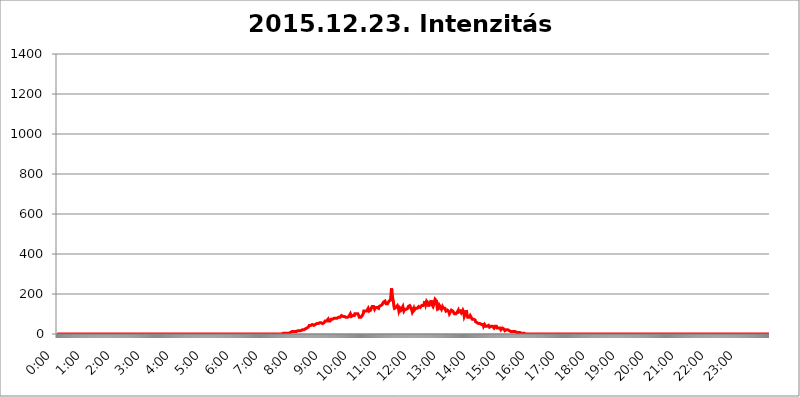
| Category | 2015.12.23. Intenzitás [W/m^2] |
|---|---|
| 0.0 | 0 |
| 0.0006944444444444445 | 0 |
| 0.001388888888888889 | 0 |
| 0.0020833333333333333 | 0 |
| 0.002777777777777778 | 0 |
| 0.003472222222222222 | 0 |
| 0.004166666666666667 | 0 |
| 0.004861111111111111 | 0 |
| 0.005555555555555556 | 0 |
| 0.0062499999999999995 | 0 |
| 0.006944444444444444 | 0 |
| 0.007638888888888889 | 0 |
| 0.008333333333333333 | 0 |
| 0.009027777777777779 | 0 |
| 0.009722222222222222 | 0 |
| 0.010416666666666666 | 0 |
| 0.011111111111111112 | 0 |
| 0.011805555555555555 | 0 |
| 0.012499999999999999 | 0 |
| 0.013194444444444444 | 0 |
| 0.013888888888888888 | 0 |
| 0.014583333333333332 | 0 |
| 0.015277777777777777 | 0 |
| 0.015972222222222224 | 0 |
| 0.016666666666666666 | 0 |
| 0.017361111111111112 | 0 |
| 0.018055555555555557 | 0 |
| 0.01875 | 0 |
| 0.019444444444444445 | 0 |
| 0.02013888888888889 | 0 |
| 0.020833333333333332 | 0 |
| 0.02152777777777778 | 0 |
| 0.022222222222222223 | 0 |
| 0.02291666666666667 | 0 |
| 0.02361111111111111 | 0 |
| 0.024305555555555556 | 0 |
| 0.024999999999999998 | 0 |
| 0.025694444444444447 | 0 |
| 0.02638888888888889 | 0 |
| 0.027083333333333334 | 0 |
| 0.027777777777777776 | 0 |
| 0.02847222222222222 | 0 |
| 0.029166666666666664 | 0 |
| 0.029861111111111113 | 0 |
| 0.030555555555555555 | 0 |
| 0.03125 | 0 |
| 0.03194444444444445 | 0 |
| 0.03263888888888889 | 0 |
| 0.03333333333333333 | 0 |
| 0.034027777777777775 | 0 |
| 0.034722222222222224 | 0 |
| 0.035416666666666666 | 0 |
| 0.036111111111111115 | 0 |
| 0.03680555555555556 | 0 |
| 0.0375 | 0 |
| 0.03819444444444444 | 0 |
| 0.03888888888888889 | 0 |
| 0.03958333333333333 | 0 |
| 0.04027777777777778 | 0 |
| 0.04097222222222222 | 0 |
| 0.041666666666666664 | 0 |
| 0.042361111111111106 | 0 |
| 0.04305555555555556 | 0 |
| 0.043750000000000004 | 0 |
| 0.044444444444444446 | 0 |
| 0.04513888888888889 | 0 |
| 0.04583333333333334 | 0 |
| 0.04652777777777778 | 0 |
| 0.04722222222222222 | 0 |
| 0.04791666666666666 | 0 |
| 0.04861111111111111 | 0 |
| 0.049305555555555554 | 0 |
| 0.049999999999999996 | 0 |
| 0.05069444444444445 | 0 |
| 0.051388888888888894 | 0 |
| 0.052083333333333336 | 0 |
| 0.05277777777777778 | 0 |
| 0.05347222222222222 | 0 |
| 0.05416666666666667 | 0 |
| 0.05486111111111111 | 0 |
| 0.05555555555555555 | 0 |
| 0.05625 | 0 |
| 0.05694444444444444 | 0 |
| 0.057638888888888885 | 0 |
| 0.05833333333333333 | 0 |
| 0.05902777777777778 | 0 |
| 0.059722222222222225 | 0 |
| 0.06041666666666667 | 0 |
| 0.061111111111111116 | 0 |
| 0.06180555555555556 | 0 |
| 0.0625 | 0 |
| 0.06319444444444444 | 0 |
| 0.06388888888888888 | 0 |
| 0.06458333333333334 | 0 |
| 0.06527777777777778 | 0 |
| 0.06597222222222222 | 0 |
| 0.06666666666666667 | 0 |
| 0.06736111111111111 | 0 |
| 0.06805555555555555 | 0 |
| 0.06874999999999999 | 0 |
| 0.06944444444444443 | 0 |
| 0.07013888888888889 | 0 |
| 0.07083333333333333 | 0 |
| 0.07152777777777779 | 0 |
| 0.07222222222222223 | 0 |
| 0.07291666666666667 | 0 |
| 0.07361111111111111 | 0 |
| 0.07430555555555556 | 0 |
| 0.075 | 0 |
| 0.07569444444444444 | 0 |
| 0.0763888888888889 | 0 |
| 0.07708333333333334 | 0 |
| 0.07777777777777778 | 0 |
| 0.07847222222222222 | 0 |
| 0.07916666666666666 | 0 |
| 0.0798611111111111 | 0 |
| 0.08055555555555556 | 0 |
| 0.08125 | 0 |
| 0.08194444444444444 | 0 |
| 0.08263888888888889 | 0 |
| 0.08333333333333333 | 0 |
| 0.08402777777777777 | 0 |
| 0.08472222222222221 | 0 |
| 0.08541666666666665 | 0 |
| 0.08611111111111112 | 0 |
| 0.08680555555555557 | 0 |
| 0.08750000000000001 | 0 |
| 0.08819444444444445 | 0 |
| 0.08888888888888889 | 0 |
| 0.08958333333333333 | 0 |
| 0.09027777777777778 | 0 |
| 0.09097222222222222 | 0 |
| 0.09166666666666667 | 0 |
| 0.09236111111111112 | 0 |
| 0.09305555555555556 | 0 |
| 0.09375 | 0 |
| 0.09444444444444444 | 0 |
| 0.09513888888888888 | 0 |
| 0.09583333333333333 | 0 |
| 0.09652777777777777 | 0 |
| 0.09722222222222222 | 0 |
| 0.09791666666666667 | 0 |
| 0.09861111111111111 | 0 |
| 0.09930555555555555 | 0 |
| 0.09999999999999999 | 0 |
| 0.10069444444444443 | 0 |
| 0.1013888888888889 | 0 |
| 0.10208333333333335 | 0 |
| 0.10277777777777779 | 0 |
| 0.10347222222222223 | 0 |
| 0.10416666666666667 | 0 |
| 0.10486111111111111 | 0 |
| 0.10555555555555556 | 0 |
| 0.10625 | 0 |
| 0.10694444444444444 | 0 |
| 0.1076388888888889 | 0 |
| 0.10833333333333334 | 0 |
| 0.10902777777777778 | 0 |
| 0.10972222222222222 | 0 |
| 0.1111111111111111 | 0 |
| 0.11180555555555556 | 0 |
| 0.11180555555555556 | 0 |
| 0.1125 | 0 |
| 0.11319444444444444 | 0 |
| 0.11388888888888889 | 0 |
| 0.11458333333333333 | 0 |
| 0.11527777777777777 | 0 |
| 0.11597222222222221 | 0 |
| 0.11666666666666665 | 0 |
| 0.1173611111111111 | 0 |
| 0.11805555555555557 | 0 |
| 0.11944444444444445 | 0 |
| 0.12013888888888889 | 0 |
| 0.12083333333333333 | 0 |
| 0.12152777777777778 | 0 |
| 0.12222222222222223 | 0 |
| 0.12291666666666667 | 0 |
| 0.12291666666666667 | 0 |
| 0.12361111111111112 | 0 |
| 0.12430555555555556 | 0 |
| 0.125 | 0 |
| 0.12569444444444444 | 0 |
| 0.12638888888888888 | 0 |
| 0.12708333333333333 | 0 |
| 0.16875 | 0 |
| 0.12847222222222224 | 0 |
| 0.12916666666666668 | 0 |
| 0.12986111111111112 | 0 |
| 0.13055555555555556 | 0 |
| 0.13125 | 0 |
| 0.13194444444444445 | 0 |
| 0.1326388888888889 | 0 |
| 0.13333333333333333 | 0 |
| 0.13402777777777777 | 0 |
| 0.13402777777777777 | 0 |
| 0.13472222222222222 | 0 |
| 0.13541666666666666 | 0 |
| 0.1361111111111111 | 0 |
| 0.13749999999999998 | 0 |
| 0.13819444444444443 | 0 |
| 0.1388888888888889 | 0 |
| 0.13958333333333334 | 0 |
| 0.14027777777777778 | 0 |
| 0.14097222222222222 | 0 |
| 0.14166666666666666 | 0 |
| 0.1423611111111111 | 0 |
| 0.14305555555555557 | 0 |
| 0.14375000000000002 | 0 |
| 0.14444444444444446 | 0 |
| 0.1451388888888889 | 0 |
| 0.1451388888888889 | 0 |
| 0.14652777777777778 | 0 |
| 0.14722222222222223 | 0 |
| 0.14791666666666667 | 0 |
| 0.1486111111111111 | 0 |
| 0.14930555555555555 | 0 |
| 0.15 | 0 |
| 0.15069444444444444 | 0 |
| 0.15138888888888888 | 0 |
| 0.15208333333333332 | 0 |
| 0.15277777777777776 | 0 |
| 0.15347222222222223 | 0 |
| 0.15416666666666667 | 0 |
| 0.15486111111111112 | 0 |
| 0.15555555555555556 | 0 |
| 0.15625 | 0 |
| 0.15694444444444444 | 0 |
| 0.15763888888888888 | 0 |
| 0.15833333333333333 | 0 |
| 0.15902777777777777 | 0 |
| 0.15972222222222224 | 0 |
| 0.16041666666666668 | 0 |
| 0.16111111111111112 | 0 |
| 0.16180555555555556 | 0 |
| 0.1625 | 0 |
| 0.16319444444444445 | 0 |
| 0.1638888888888889 | 0 |
| 0.16458333333333333 | 0 |
| 0.16527777777777777 | 0 |
| 0.16597222222222222 | 0 |
| 0.16666666666666666 | 0 |
| 0.1673611111111111 | 0 |
| 0.16805555555555554 | 0 |
| 0.16874999999999998 | 0 |
| 0.16944444444444443 | 0 |
| 0.17013888888888887 | 0 |
| 0.1708333333333333 | 0 |
| 0.17152777777777775 | 0 |
| 0.17222222222222225 | 0 |
| 0.1729166666666667 | 0 |
| 0.17361111111111113 | 0 |
| 0.17430555555555557 | 0 |
| 0.17500000000000002 | 0 |
| 0.17569444444444446 | 0 |
| 0.1763888888888889 | 0 |
| 0.17708333333333334 | 0 |
| 0.17777777777777778 | 0 |
| 0.17847222222222223 | 0 |
| 0.17916666666666667 | 0 |
| 0.1798611111111111 | 0 |
| 0.18055555555555555 | 0 |
| 0.18125 | 0 |
| 0.18194444444444444 | 0 |
| 0.1826388888888889 | 0 |
| 0.18333333333333335 | 0 |
| 0.1840277777777778 | 0 |
| 0.18472222222222223 | 0 |
| 0.18541666666666667 | 0 |
| 0.18611111111111112 | 0 |
| 0.18680555555555556 | 0 |
| 0.1875 | 0 |
| 0.18819444444444444 | 0 |
| 0.18888888888888888 | 0 |
| 0.18958333333333333 | 0 |
| 0.19027777777777777 | 0 |
| 0.1909722222222222 | 0 |
| 0.19166666666666665 | 0 |
| 0.19236111111111112 | 0 |
| 0.19305555555555554 | 0 |
| 0.19375 | 0 |
| 0.19444444444444445 | 0 |
| 0.1951388888888889 | 0 |
| 0.19583333333333333 | 0 |
| 0.19652777777777777 | 0 |
| 0.19722222222222222 | 0 |
| 0.19791666666666666 | 0 |
| 0.1986111111111111 | 0 |
| 0.19930555555555554 | 0 |
| 0.19999999999999998 | 0 |
| 0.20069444444444443 | 0 |
| 0.20138888888888887 | 0 |
| 0.2020833333333333 | 0 |
| 0.2027777777777778 | 0 |
| 0.2034722222222222 | 0 |
| 0.2041666666666667 | 0 |
| 0.20486111111111113 | 0 |
| 0.20555555555555557 | 0 |
| 0.20625000000000002 | 0 |
| 0.20694444444444446 | 0 |
| 0.2076388888888889 | 0 |
| 0.20833333333333334 | 0 |
| 0.20902777777777778 | 0 |
| 0.20972222222222223 | 0 |
| 0.21041666666666667 | 0 |
| 0.2111111111111111 | 0 |
| 0.21180555555555555 | 0 |
| 0.2125 | 0 |
| 0.21319444444444444 | 0 |
| 0.2138888888888889 | 0 |
| 0.21458333333333335 | 0 |
| 0.2152777777777778 | 0 |
| 0.21597222222222223 | 0 |
| 0.21666666666666667 | 0 |
| 0.21736111111111112 | 0 |
| 0.21805555555555556 | 0 |
| 0.21875 | 0 |
| 0.21944444444444444 | 0 |
| 0.22013888888888888 | 0 |
| 0.22083333333333333 | 0 |
| 0.22152777777777777 | 0 |
| 0.2222222222222222 | 0 |
| 0.22291666666666665 | 0 |
| 0.2236111111111111 | 0 |
| 0.22430555555555556 | 0 |
| 0.225 | 0 |
| 0.22569444444444445 | 0 |
| 0.2263888888888889 | 0 |
| 0.22708333333333333 | 0 |
| 0.22777777777777777 | 0 |
| 0.22847222222222222 | 0 |
| 0.22916666666666666 | 0 |
| 0.2298611111111111 | 0 |
| 0.23055555555555554 | 0 |
| 0.23124999999999998 | 0 |
| 0.23194444444444443 | 0 |
| 0.23263888888888887 | 0 |
| 0.2333333333333333 | 0 |
| 0.2340277777777778 | 0 |
| 0.2347222222222222 | 0 |
| 0.2354166666666667 | 0 |
| 0.23611111111111113 | 0 |
| 0.23680555555555557 | 0 |
| 0.23750000000000002 | 0 |
| 0.23819444444444446 | 0 |
| 0.2388888888888889 | 0 |
| 0.23958333333333334 | 0 |
| 0.24027777777777778 | 0 |
| 0.24097222222222223 | 0 |
| 0.24166666666666667 | 0 |
| 0.2423611111111111 | 0 |
| 0.24305555555555555 | 0 |
| 0.24375 | 0 |
| 0.24444444444444446 | 0 |
| 0.24513888888888888 | 0 |
| 0.24583333333333335 | 0 |
| 0.2465277777777778 | 0 |
| 0.24722222222222223 | 0 |
| 0.24791666666666667 | 0 |
| 0.24861111111111112 | 0 |
| 0.24930555555555556 | 0 |
| 0.25 | 0 |
| 0.25069444444444444 | 0 |
| 0.2513888888888889 | 0 |
| 0.2520833333333333 | 0 |
| 0.25277777777777777 | 0 |
| 0.2534722222222222 | 0 |
| 0.25416666666666665 | 0 |
| 0.2548611111111111 | 0 |
| 0.2555555555555556 | 0 |
| 0.25625000000000003 | 0 |
| 0.2569444444444445 | 0 |
| 0.2576388888888889 | 0 |
| 0.25833333333333336 | 0 |
| 0.2590277777777778 | 0 |
| 0.25972222222222224 | 0 |
| 0.2604166666666667 | 0 |
| 0.2611111111111111 | 0 |
| 0.26180555555555557 | 0 |
| 0.2625 | 0 |
| 0.26319444444444445 | 0 |
| 0.2638888888888889 | 0 |
| 0.26458333333333334 | 0 |
| 0.2652777777777778 | 0 |
| 0.2659722222222222 | 0 |
| 0.26666666666666666 | 0 |
| 0.2673611111111111 | 0 |
| 0.26805555555555555 | 0 |
| 0.26875 | 0 |
| 0.26944444444444443 | 0 |
| 0.2701388888888889 | 0 |
| 0.2708333333333333 | 0 |
| 0.27152777777777776 | 0 |
| 0.2722222222222222 | 0 |
| 0.27291666666666664 | 0 |
| 0.2736111111111111 | 0 |
| 0.2743055555555555 | 0 |
| 0.27499999999999997 | 0 |
| 0.27569444444444446 | 0 |
| 0.27638888888888885 | 0 |
| 0.27708333333333335 | 0 |
| 0.2777777777777778 | 0 |
| 0.27847222222222223 | 0 |
| 0.2791666666666667 | 0 |
| 0.2798611111111111 | 0 |
| 0.28055555555555556 | 0 |
| 0.28125 | 0 |
| 0.28194444444444444 | 0 |
| 0.2826388888888889 | 0 |
| 0.2833333333333333 | 0 |
| 0.28402777777777777 | 0 |
| 0.2847222222222222 | 0 |
| 0.28541666666666665 | 0 |
| 0.28611111111111115 | 0 |
| 0.28680555555555554 | 0 |
| 0.28750000000000003 | 0 |
| 0.2881944444444445 | 0 |
| 0.2888888888888889 | 0 |
| 0.28958333333333336 | 0 |
| 0.2902777777777778 | 0 |
| 0.29097222222222224 | 0 |
| 0.2916666666666667 | 0 |
| 0.2923611111111111 | 0 |
| 0.29305555555555557 | 0 |
| 0.29375 | 0 |
| 0.29444444444444445 | 0 |
| 0.2951388888888889 | 0 |
| 0.29583333333333334 | 0 |
| 0.2965277777777778 | 0 |
| 0.2972222222222222 | 0 |
| 0.29791666666666666 | 0 |
| 0.2986111111111111 | 0 |
| 0.29930555555555555 | 0 |
| 0.3 | 0 |
| 0.30069444444444443 | 0 |
| 0.3013888888888889 | 0 |
| 0.3020833333333333 | 0 |
| 0.30277777777777776 | 0 |
| 0.3034722222222222 | 0 |
| 0.30416666666666664 | 0 |
| 0.3048611111111111 | 0 |
| 0.3055555555555555 | 0 |
| 0.30624999999999997 | 0 |
| 0.3069444444444444 | 0 |
| 0.3076388888888889 | 0 |
| 0.30833333333333335 | 0 |
| 0.3090277777777778 | 0 |
| 0.30972222222222223 | 0 |
| 0.3104166666666667 | 0 |
| 0.3111111111111111 | 0 |
| 0.31180555555555556 | 0 |
| 0.3125 | 0 |
| 0.31319444444444444 | 0 |
| 0.3138888888888889 | 0 |
| 0.3145833333333333 | 0 |
| 0.31527777777777777 | 0 |
| 0.3159722222222222 | 0 |
| 0.31666666666666665 | 3.525 |
| 0.31736111111111115 | 0 |
| 0.31805555555555554 | 3.525 |
| 0.31875000000000003 | 3.525 |
| 0.3194444444444445 | 3.525 |
| 0.3201388888888889 | 3.525 |
| 0.32083333333333336 | 3.525 |
| 0.3215277777777778 | 3.525 |
| 0.32222222222222224 | 3.525 |
| 0.3229166666666667 | 3.525 |
| 0.3236111111111111 | 3.525 |
| 0.32430555555555557 | 3.525 |
| 0.325 | 3.525 |
| 0.32569444444444445 | 3.525 |
| 0.3263888888888889 | 7.887 |
| 0.32708333333333334 | 7.887 |
| 0.3277777777777778 | 7.887 |
| 0.3284722222222222 | 7.887 |
| 0.32916666666666666 | 12.257 |
| 0.3298611111111111 | 7.887 |
| 0.33055555555555555 | 7.887 |
| 0.33125 | 12.257 |
| 0.33194444444444443 | 12.257 |
| 0.3326388888888889 | 12.257 |
| 0.3333333333333333 | 12.257 |
| 0.3340277777777778 | 12.257 |
| 0.3347222222222222 | 12.257 |
| 0.3354166666666667 | 12.257 |
| 0.3361111111111111 | 12.257 |
| 0.3368055555555556 | 16.636 |
| 0.33749999999999997 | 16.636 |
| 0.33819444444444446 | 16.636 |
| 0.33888888888888885 | 16.636 |
| 0.33958333333333335 | 16.636 |
| 0.34027777777777773 | 16.636 |
| 0.34097222222222223 | 16.636 |
| 0.3416666666666666 | 16.636 |
| 0.3423611111111111 | 16.636 |
| 0.3430555555555555 | 16.636 |
| 0.34375 | 21.024 |
| 0.3444444444444445 | 21.024 |
| 0.3451388888888889 | 25.419 |
| 0.3458333333333334 | 21.024 |
| 0.34652777777777777 | 21.024 |
| 0.34722222222222227 | 25.419 |
| 0.34791666666666665 | 25.419 |
| 0.34861111111111115 | 29.823 |
| 0.34930555555555554 | 29.823 |
| 0.35000000000000003 | 29.823 |
| 0.3506944444444444 | 29.823 |
| 0.3513888888888889 | 34.234 |
| 0.3520833333333333 | 34.234 |
| 0.3527777777777778 | 34.234 |
| 0.3534722222222222 | 43.079 |
| 0.3541666666666667 | 47.511 |
| 0.3548611111111111 | 47.511 |
| 0.35555555555555557 | 43.079 |
| 0.35625 | 43.079 |
| 0.35694444444444445 | 43.079 |
| 0.3576388888888889 | 47.511 |
| 0.35833333333333334 | 47.511 |
| 0.3590277777777778 | 43.079 |
| 0.3597222222222222 | 43.079 |
| 0.36041666666666666 | 47.511 |
| 0.3611111111111111 | 47.511 |
| 0.36180555555555555 | 47.511 |
| 0.3625 | 47.511 |
| 0.36319444444444443 | 51.951 |
| 0.3638888888888889 | 51.951 |
| 0.3645833333333333 | 51.951 |
| 0.3652777777777778 | 51.951 |
| 0.3659722222222222 | 51.951 |
| 0.3666666666666667 | 51.951 |
| 0.3673611111111111 | 56.398 |
| 0.3680555555555556 | 56.398 |
| 0.36874999999999997 | 56.398 |
| 0.36944444444444446 | 60.85 |
| 0.37013888888888885 | 56.398 |
| 0.37083333333333335 | 56.398 |
| 0.37152777777777773 | 56.398 |
| 0.37222222222222223 | 51.951 |
| 0.3729166666666666 | 56.398 |
| 0.3736111111111111 | 56.398 |
| 0.3743055555555555 | 56.398 |
| 0.375 | 56.398 |
| 0.3756944444444445 | 65.31 |
| 0.3763888888888889 | 65.31 |
| 0.3770833333333334 | 69.775 |
| 0.37777777777777777 | 65.31 |
| 0.37847222222222227 | 65.31 |
| 0.37916666666666665 | 69.775 |
| 0.37986111111111115 | 74.246 |
| 0.38055555555555554 | 65.31 |
| 0.38125000000000003 | 65.31 |
| 0.3819444444444444 | 65.31 |
| 0.3826388888888889 | 65.31 |
| 0.3833333333333333 | 65.31 |
| 0.3840277777777778 | 74.246 |
| 0.3847222222222222 | 74.246 |
| 0.3854166666666667 | 74.246 |
| 0.3861111111111111 | 74.246 |
| 0.38680555555555557 | 74.246 |
| 0.3875 | 78.722 |
| 0.38819444444444445 | 78.722 |
| 0.3888888888888889 | 74.246 |
| 0.38958333333333334 | 74.246 |
| 0.3902777777777778 | 78.722 |
| 0.3909722222222222 | 78.722 |
| 0.39166666666666666 | 78.722 |
| 0.3923611111111111 | 78.722 |
| 0.39305555555555555 | 78.722 |
| 0.39375 | 78.722 |
| 0.39444444444444443 | 83.205 |
| 0.3951388888888889 | 83.205 |
| 0.3958333333333333 | 87.692 |
| 0.3965277777777778 | 83.205 |
| 0.3972222222222222 | 83.205 |
| 0.3979166666666667 | 83.205 |
| 0.3986111111111111 | 92.184 |
| 0.3993055555555556 | 87.692 |
| 0.39999999999999997 | 92.184 |
| 0.40069444444444446 | 87.692 |
| 0.40138888888888885 | 87.692 |
| 0.40208333333333335 | 92.184 |
| 0.40277777777777773 | 87.692 |
| 0.40347222222222223 | 92.184 |
| 0.4041666666666666 | 92.184 |
| 0.4048611111111111 | 83.205 |
| 0.4055555555555555 | 78.722 |
| 0.40625 | 78.722 |
| 0.4069444444444445 | 83.205 |
| 0.4076388888888889 | 83.205 |
| 0.4083333333333334 | 87.692 |
| 0.40902777777777777 | 87.692 |
| 0.40972222222222227 | 87.692 |
| 0.41041666666666665 | 92.184 |
| 0.41111111111111115 | 101.184 |
| 0.41180555555555554 | 101.184 |
| 0.41250000000000003 | 87.692 |
| 0.4131944444444444 | 83.205 |
| 0.4138888888888889 | 87.692 |
| 0.4145833333333333 | 92.184 |
| 0.4152777777777778 | 92.184 |
| 0.4159722222222222 | 92.184 |
| 0.4166666666666667 | 92.184 |
| 0.4173611111111111 | 101.184 |
| 0.41805555555555557 | 101.184 |
| 0.41875 | 105.69 |
| 0.41944444444444445 | 101.184 |
| 0.4201388888888889 | 96.682 |
| 0.42083333333333334 | 96.682 |
| 0.4215277777777778 | 101.184 |
| 0.4222222222222222 | 96.682 |
| 0.42291666666666666 | 92.184 |
| 0.4236111111111111 | 83.205 |
| 0.42430555555555555 | 78.722 |
| 0.425 | 87.692 |
| 0.42569444444444443 | 83.205 |
| 0.4263888888888889 | 87.692 |
| 0.4270833333333333 | 87.692 |
| 0.4277777777777778 | 92.184 |
| 0.4284722222222222 | 92.184 |
| 0.4291666666666667 | 101.184 |
| 0.4298611111111111 | 114.716 |
| 0.4305555555555556 | 119.235 |
| 0.43124999999999997 | 114.716 |
| 0.43194444444444446 | 114.716 |
| 0.43263888888888885 | 114.716 |
| 0.43333333333333335 | 114.716 |
| 0.43402777777777773 | 114.716 |
| 0.43472222222222223 | 119.235 |
| 0.4354166666666666 | 119.235 |
| 0.4361111111111111 | 128.284 |
| 0.4368055555555555 | 128.284 |
| 0.4375 | 114.716 |
| 0.4381944444444445 | 110.201 |
| 0.4388888888888889 | 114.716 |
| 0.4395833333333334 | 119.235 |
| 0.44027777777777777 | 128.284 |
| 0.44097222222222227 | 132.814 |
| 0.44166666666666665 | 137.347 |
| 0.44236111111111115 | 137.347 |
| 0.44305555555555554 | 137.347 |
| 0.44375000000000003 | 137.347 |
| 0.4444444444444444 | 137.347 |
| 0.4451388888888889 | 123.758 |
| 0.4458333333333333 | 123.758 |
| 0.4465277777777778 | 132.814 |
| 0.4472222222222222 | 132.814 |
| 0.4479166666666667 | 128.284 |
| 0.4486111111111111 | 132.814 |
| 0.44930555555555557 | 128.284 |
| 0.45 | 128.284 |
| 0.45069444444444445 | 128.284 |
| 0.4513888888888889 | 137.347 |
| 0.45208333333333334 | 132.814 |
| 0.4527777777777778 | 137.347 |
| 0.4534722222222222 | 141.884 |
| 0.45416666666666666 | 146.423 |
| 0.4548611111111111 | 146.423 |
| 0.45555555555555555 | 146.423 |
| 0.45625 | 146.423 |
| 0.45694444444444443 | 150.964 |
| 0.4576388888888889 | 160.056 |
| 0.4583333333333333 | 155.509 |
| 0.4590277777777778 | 155.509 |
| 0.4597222222222222 | 164.605 |
| 0.4604166666666667 | 164.605 |
| 0.4611111111111111 | 150.964 |
| 0.4618055555555556 | 146.423 |
| 0.46249999999999997 | 146.423 |
| 0.46319444444444446 | 150.964 |
| 0.46388888888888885 | 150.964 |
| 0.46458333333333335 | 146.423 |
| 0.46527777777777773 | 164.605 |
| 0.46597222222222223 | 164.605 |
| 0.4666666666666666 | 160.056 |
| 0.4673611111111111 | 169.156 |
| 0.4680555555555555 | 196.497 |
| 0.46875 | 228.436 |
| 0.4694444444444445 | 214.746 |
| 0.4701388888888889 | 187.378 |
| 0.4708333333333334 | 173.709 |
| 0.47152777777777777 | 160.056 |
| 0.47222222222222227 | 137.347 |
| 0.47291666666666665 | 128.284 |
| 0.47361111111111115 | 128.284 |
| 0.47430555555555554 | 128.284 |
| 0.47500000000000003 | 132.814 |
| 0.4756944444444444 | 128.284 |
| 0.4763888888888889 | 128.284 |
| 0.4770833333333333 | 141.884 |
| 0.4777777777777778 | 137.347 |
| 0.4784722222222222 | 128.284 |
| 0.4791666666666667 | 114.716 |
| 0.4798611111111111 | 119.235 |
| 0.48055555555555557 | 128.284 |
| 0.48125 | 128.284 |
| 0.48194444444444445 | 119.235 |
| 0.4826388888888889 | 123.758 |
| 0.48333333333333334 | 128.284 |
| 0.4840277777777778 | 132.814 |
| 0.4847222222222222 | 137.347 |
| 0.48541666666666666 | 123.758 |
| 0.4861111111111111 | 114.716 |
| 0.48680555555555555 | 119.235 |
| 0.4875 | 123.758 |
| 0.48819444444444443 | 128.284 |
| 0.4888888888888889 | 128.284 |
| 0.4895833333333333 | 123.758 |
| 0.4902777777777778 | 123.758 |
| 0.4909722222222222 | 123.758 |
| 0.4916666666666667 | 128.284 |
| 0.4923611111111111 | 137.347 |
| 0.4930555555555556 | 137.347 |
| 0.49374999999999997 | 141.884 |
| 0.49444444444444446 | 141.884 |
| 0.49513888888888885 | 137.347 |
| 0.49583333333333335 | 132.814 |
| 0.49652777777777773 | 128.284 |
| 0.49722222222222223 | 119.235 |
| 0.4979166666666666 | 110.201 |
| 0.4986111111111111 | 110.201 |
| 0.4993055555555555 | 114.716 |
| 0.5 | 128.284 |
| 0.5006944444444444 | 119.235 |
| 0.5013888888888889 | 119.235 |
| 0.5020833333333333 | 123.758 |
| 0.5027777777777778 | 128.284 |
| 0.5034722222222222 | 128.284 |
| 0.5041666666666667 | 128.284 |
| 0.5048611111111111 | 128.284 |
| 0.5055555555555555 | 132.814 |
| 0.50625 | 132.814 |
| 0.5069444444444444 | 137.347 |
| 0.5076388888888889 | 132.814 |
| 0.5083333333333333 | 132.814 |
| 0.5090277777777777 | 132.814 |
| 0.5097222222222222 | 128.284 |
| 0.5104166666666666 | 132.814 |
| 0.5111111111111112 | 141.884 |
| 0.5118055555555555 | 137.347 |
| 0.5125000000000001 | 137.347 |
| 0.5131944444444444 | 141.884 |
| 0.513888888888889 | 141.884 |
| 0.5145833333333333 | 150.964 |
| 0.5152777777777778 | 164.605 |
| 0.5159722222222222 | 155.509 |
| 0.5166666666666667 | 146.423 |
| 0.517361111111111 | 141.884 |
| 0.5180555555555556 | 164.605 |
| 0.5187499999999999 | 164.605 |
| 0.5194444444444445 | 164.605 |
| 0.5201388888888888 | 155.509 |
| 0.5208333333333334 | 137.347 |
| 0.5215277777777778 | 137.347 |
| 0.5222222222222223 | 150.964 |
| 0.5229166666666667 | 150.964 |
| 0.5236111111111111 | 160.056 |
| 0.5243055555555556 | 169.156 |
| 0.525 | 155.509 |
| 0.5256944444444445 | 146.423 |
| 0.5263888888888889 | 141.884 |
| 0.5270833333333333 | 137.347 |
| 0.5277777777777778 | 137.347 |
| 0.5284722222222222 | 150.964 |
| 0.5291666666666667 | 164.605 |
| 0.5298611111111111 | 173.709 |
| 0.5305555555555556 | 173.709 |
| 0.53125 | 178.264 |
| 0.5319444444444444 | 164.605 |
| 0.5326388888888889 | 137.347 |
| 0.5333333333333333 | 123.758 |
| 0.5340277777777778 | 119.235 |
| 0.5347222222222222 | 123.758 |
| 0.5354166666666667 | 128.284 |
| 0.5361111111111111 | 141.884 |
| 0.5368055555555555 | 146.423 |
| 0.5375 | 132.814 |
| 0.5381944444444444 | 128.284 |
| 0.5388888888888889 | 123.758 |
| 0.5395833333333333 | 128.284 |
| 0.5402777777777777 | 137.347 |
| 0.5409722222222222 | 132.814 |
| 0.5416666666666666 | 128.284 |
| 0.5423611111111112 | 132.814 |
| 0.5430555555555555 | 132.814 |
| 0.5437500000000001 | 128.284 |
| 0.5444444444444444 | 123.758 |
| 0.545138888888889 | 114.716 |
| 0.5458333333333333 | 110.201 |
| 0.5465277777777778 | 110.201 |
| 0.5472222222222222 | 119.235 |
| 0.5479166666666667 | 119.235 |
| 0.548611111111111 | 119.235 |
| 0.5493055555555556 | 110.201 |
| 0.5499999999999999 | 101.184 |
| 0.5506944444444445 | 101.184 |
| 0.5513888888888888 | 110.201 |
| 0.5520833333333334 | 114.716 |
| 0.5527777777777778 | 119.235 |
| 0.5534722222222223 | 119.235 |
| 0.5541666666666667 | 119.235 |
| 0.5548611111111111 | 114.716 |
| 0.5555555555555556 | 114.716 |
| 0.55625 | 110.201 |
| 0.5569444444444445 | 101.184 |
| 0.5576388888888889 | 101.184 |
| 0.5583333333333333 | 101.184 |
| 0.5590277777777778 | 101.184 |
| 0.5597222222222222 | 105.69 |
| 0.5604166666666667 | 105.69 |
| 0.5611111111111111 | 110.201 |
| 0.5618055555555556 | 114.716 |
| 0.5625 | 119.235 |
| 0.5631944444444444 | 110.201 |
| 0.5638888888888889 | 110.201 |
| 0.5645833333333333 | 110.201 |
| 0.5652777777777778 | 114.716 |
| 0.5659722222222222 | 114.716 |
| 0.5666666666666667 | 105.69 |
| 0.5673611111111111 | 101.184 |
| 0.5680555555555555 | 105.69 |
| 0.56875 | 119.235 |
| 0.5694444444444444 | 119.235 |
| 0.5701388888888889 | 105.69 |
| 0.5708333333333333 | 87.692 |
| 0.5715277777777777 | 83.205 |
| 0.5722222222222222 | 92.184 |
| 0.5729166666666666 | 105.69 |
| 0.5736111111111112 | 119.235 |
| 0.5743055555555555 | 110.201 |
| 0.5750000000000001 | 92.184 |
| 0.5756944444444444 | 83.205 |
| 0.576388888888889 | 78.722 |
| 0.5770833333333333 | 78.722 |
| 0.5777777777777778 | 83.205 |
| 0.5784722222222222 | 83.205 |
| 0.5791666666666667 | 92.184 |
| 0.579861111111111 | 87.692 |
| 0.5805555555555556 | 83.205 |
| 0.5812499999999999 | 78.722 |
| 0.5819444444444445 | 74.246 |
| 0.5826388888888888 | 74.246 |
| 0.5833333333333334 | 74.246 |
| 0.5840277777777778 | 74.246 |
| 0.5847222222222223 | 78.722 |
| 0.5854166666666667 | 78.722 |
| 0.5861111111111111 | 69.775 |
| 0.5868055555555556 | 60.85 |
| 0.5875 | 56.398 |
| 0.5881944444444445 | 60.85 |
| 0.5888888888888889 | 56.398 |
| 0.5895833333333333 | 56.398 |
| 0.5902777777777778 | 56.398 |
| 0.5909722222222222 | 51.951 |
| 0.5916666666666667 | 47.511 |
| 0.5923611111111111 | 47.511 |
| 0.5930555555555556 | 51.951 |
| 0.59375 | 51.951 |
| 0.5944444444444444 | 51.951 |
| 0.5951388888888889 | 47.511 |
| 0.5958333333333333 | 47.511 |
| 0.5965277777777778 | 47.511 |
| 0.5972222222222222 | 47.511 |
| 0.5979166666666667 | 38.653 |
| 0.5986111111111111 | 43.079 |
| 0.5993055555555555 | 47.511 |
| 0.6 | 43.079 |
| 0.6006944444444444 | 38.653 |
| 0.6013888888888889 | 43.079 |
| 0.6020833333333333 | 38.653 |
| 0.6027777777777777 | 38.653 |
| 0.6034722222222222 | 38.653 |
| 0.6041666666666666 | 38.653 |
| 0.6048611111111112 | 43.079 |
| 0.6055555555555555 | 38.653 |
| 0.6062500000000001 | 34.234 |
| 0.6069444444444444 | 34.234 |
| 0.607638888888889 | 38.653 |
| 0.6083333333333333 | 38.653 |
| 0.6090277777777778 | 38.653 |
| 0.6097222222222222 | 38.653 |
| 0.6104166666666667 | 38.653 |
| 0.611111111111111 | 43.079 |
| 0.6118055555555556 | 38.653 |
| 0.6124999999999999 | 29.823 |
| 0.6131944444444445 | 34.234 |
| 0.6138888888888888 | 38.653 |
| 0.6145833333333334 | 38.653 |
| 0.6152777777777778 | 43.079 |
| 0.6159722222222223 | 38.653 |
| 0.6166666666666667 | 29.823 |
| 0.6173611111111111 | 29.823 |
| 0.6180555555555556 | 29.823 |
| 0.61875 | 29.823 |
| 0.6194444444444445 | 25.419 |
| 0.6201388888888889 | 29.823 |
| 0.6208333333333333 | 29.823 |
| 0.6215277777777778 | 25.419 |
| 0.6222222222222222 | 21.024 |
| 0.6229166666666667 | 21.024 |
| 0.6236111111111111 | 25.419 |
| 0.6243055555555556 | 29.823 |
| 0.625 | 29.823 |
| 0.6256944444444444 | 25.419 |
| 0.6263888888888889 | 25.419 |
| 0.6270833333333333 | 21.024 |
| 0.6277777777777778 | 16.636 |
| 0.6284722222222222 | 16.636 |
| 0.6291666666666667 | 16.636 |
| 0.6298611111111111 | 21.024 |
| 0.6305555555555555 | 21.024 |
| 0.63125 | 25.419 |
| 0.6319444444444444 | 21.024 |
| 0.6326388888888889 | 16.636 |
| 0.6333333333333333 | 16.636 |
| 0.6340277777777777 | 16.636 |
| 0.6347222222222222 | 16.636 |
| 0.6354166666666666 | 16.636 |
| 0.6361111111111112 | 12.257 |
| 0.6368055555555555 | 12.257 |
| 0.6375000000000001 | 12.257 |
| 0.6381944444444444 | 12.257 |
| 0.638888888888889 | 12.257 |
| 0.6395833333333333 | 7.887 |
| 0.6402777777777778 | 12.257 |
| 0.6409722222222222 | 12.257 |
| 0.6416666666666667 | 12.257 |
| 0.642361111111111 | 12.257 |
| 0.6430555555555556 | 7.887 |
| 0.6437499999999999 | 7.887 |
| 0.6444444444444445 | 7.887 |
| 0.6451388888888888 | 7.887 |
| 0.6458333333333334 | 7.887 |
| 0.6465277777777778 | 7.887 |
| 0.6472222222222223 | 7.887 |
| 0.6479166666666667 | 7.887 |
| 0.6486111111111111 | 7.887 |
| 0.6493055555555556 | 3.525 |
| 0.65 | 3.525 |
| 0.6506944444444445 | 3.525 |
| 0.6513888888888889 | 3.525 |
| 0.6520833333333333 | 3.525 |
| 0.6527777777777778 | 3.525 |
| 0.6534722222222222 | 3.525 |
| 0.6541666666666667 | 3.525 |
| 0.6548611111111111 | 3.525 |
| 0.6555555555555556 | 3.525 |
| 0.65625 | 0 |
| 0.6569444444444444 | 0 |
| 0.6576388888888889 | 0 |
| 0.6583333333333333 | 0 |
| 0.6590277777777778 | 0 |
| 0.6597222222222222 | 0 |
| 0.6604166666666667 | 0 |
| 0.6611111111111111 | 0 |
| 0.6618055555555555 | 0 |
| 0.6625 | 0 |
| 0.6631944444444444 | 0 |
| 0.6638888888888889 | 0 |
| 0.6645833333333333 | 0 |
| 0.6652777777777777 | 0 |
| 0.6659722222222222 | 0 |
| 0.6666666666666666 | 0 |
| 0.6673611111111111 | 0 |
| 0.6680555555555556 | 0 |
| 0.6687500000000001 | 0 |
| 0.6694444444444444 | 0 |
| 0.6701388888888888 | 0 |
| 0.6708333333333334 | 0 |
| 0.6715277777777778 | 0 |
| 0.6722222222222222 | 0 |
| 0.6729166666666666 | 0 |
| 0.6736111111111112 | 0 |
| 0.6743055555555556 | 0 |
| 0.6749999999999999 | 0 |
| 0.6756944444444444 | 0 |
| 0.6763888888888889 | 0 |
| 0.6770833333333334 | 0 |
| 0.6777777777777777 | 0 |
| 0.6784722222222223 | 0 |
| 0.6791666666666667 | 0 |
| 0.6798611111111111 | 0 |
| 0.6805555555555555 | 0 |
| 0.68125 | 0 |
| 0.6819444444444445 | 0 |
| 0.6826388888888889 | 0 |
| 0.6833333333333332 | 0 |
| 0.6840277777777778 | 0 |
| 0.6847222222222222 | 0 |
| 0.6854166666666667 | 0 |
| 0.686111111111111 | 0 |
| 0.6868055555555556 | 0 |
| 0.6875 | 0 |
| 0.6881944444444444 | 0 |
| 0.688888888888889 | 0 |
| 0.6895833333333333 | 0 |
| 0.6902777777777778 | 0 |
| 0.6909722222222222 | 0 |
| 0.6916666666666668 | 0 |
| 0.6923611111111111 | 0 |
| 0.6930555555555555 | 0 |
| 0.69375 | 0 |
| 0.6944444444444445 | 0 |
| 0.6951388888888889 | 0 |
| 0.6958333333333333 | 0 |
| 0.6965277777777777 | 0 |
| 0.6972222222222223 | 0 |
| 0.6979166666666666 | 0 |
| 0.6986111111111111 | 0 |
| 0.6993055555555556 | 0 |
| 0.7000000000000001 | 0 |
| 0.7006944444444444 | 0 |
| 0.7013888888888888 | 0 |
| 0.7020833333333334 | 0 |
| 0.7027777777777778 | 0 |
| 0.7034722222222222 | 0 |
| 0.7041666666666666 | 0 |
| 0.7048611111111112 | 0 |
| 0.7055555555555556 | 0 |
| 0.7062499999999999 | 0 |
| 0.7069444444444444 | 0 |
| 0.7076388888888889 | 0 |
| 0.7083333333333334 | 0 |
| 0.7090277777777777 | 0 |
| 0.7097222222222223 | 0 |
| 0.7104166666666667 | 0 |
| 0.7111111111111111 | 0 |
| 0.7118055555555555 | 0 |
| 0.7125 | 0 |
| 0.7131944444444445 | 0 |
| 0.7138888888888889 | 0 |
| 0.7145833333333332 | 0 |
| 0.7152777777777778 | 0 |
| 0.7159722222222222 | 0 |
| 0.7166666666666667 | 0 |
| 0.717361111111111 | 0 |
| 0.7180555555555556 | 0 |
| 0.71875 | 0 |
| 0.7194444444444444 | 0 |
| 0.720138888888889 | 0 |
| 0.7208333333333333 | 0 |
| 0.7215277777777778 | 0 |
| 0.7222222222222222 | 0 |
| 0.7229166666666668 | 0 |
| 0.7236111111111111 | 0 |
| 0.7243055555555555 | 0 |
| 0.725 | 0 |
| 0.7256944444444445 | 0 |
| 0.7263888888888889 | 0 |
| 0.7270833333333333 | 0 |
| 0.7277777777777777 | 0 |
| 0.7284722222222223 | 0 |
| 0.7291666666666666 | 0 |
| 0.7298611111111111 | 0 |
| 0.7305555555555556 | 0 |
| 0.7312500000000001 | 0 |
| 0.7319444444444444 | 0 |
| 0.7326388888888888 | 0 |
| 0.7333333333333334 | 0 |
| 0.7340277777777778 | 0 |
| 0.7347222222222222 | 0 |
| 0.7354166666666666 | 0 |
| 0.7361111111111112 | 0 |
| 0.7368055555555556 | 0 |
| 0.7374999999999999 | 0 |
| 0.7381944444444444 | 0 |
| 0.7388888888888889 | 0 |
| 0.7395833333333334 | 0 |
| 0.7402777777777777 | 0 |
| 0.7409722222222223 | 0 |
| 0.7416666666666667 | 0 |
| 0.7423611111111111 | 0 |
| 0.7430555555555555 | 0 |
| 0.74375 | 0 |
| 0.7444444444444445 | 0 |
| 0.7451388888888889 | 0 |
| 0.7458333333333332 | 0 |
| 0.7465277777777778 | 0 |
| 0.7472222222222222 | 0 |
| 0.7479166666666667 | 0 |
| 0.748611111111111 | 0 |
| 0.7493055555555556 | 0 |
| 0.75 | 0 |
| 0.7506944444444444 | 0 |
| 0.751388888888889 | 0 |
| 0.7520833333333333 | 0 |
| 0.7527777777777778 | 0 |
| 0.7534722222222222 | 0 |
| 0.7541666666666668 | 0 |
| 0.7548611111111111 | 0 |
| 0.7555555555555555 | 0 |
| 0.75625 | 0 |
| 0.7569444444444445 | 0 |
| 0.7576388888888889 | 0 |
| 0.7583333333333333 | 0 |
| 0.7590277777777777 | 0 |
| 0.7597222222222223 | 0 |
| 0.7604166666666666 | 0 |
| 0.7611111111111111 | 0 |
| 0.7618055555555556 | 0 |
| 0.7625000000000001 | 0 |
| 0.7631944444444444 | 0 |
| 0.7638888888888888 | 0 |
| 0.7645833333333334 | 0 |
| 0.7652777777777778 | 0 |
| 0.7659722222222222 | 0 |
| 0.7666666666666666 | 0 |
| 0.7673611111111112 | 0 |
| 0.7680555555555556 | 0 |
| 0.7687499999999999 | 0 |
| 0.7694444444444444 | 0 |
| 0.7701388888888889 | 0 |
| 0.7708333333333334 | 0 |
| 0.7715277777777777 | 0 |
| 0.7722222222222223 | 0 |
| 0.7729166666666667 | 0 |
| 0.7736111111111111 | 0 |
| 0.7743055555555555 | 0 |
| 0.775 | 0 |
| 0.7756944444444445 | 0 |
| 0.7763888888888889 | 0 |
| 0.7770833333333332 | 0 |
| 0.7777777777777778 | 0 |
| 0.7784722222222222 | 0 |
| 0.7791666666666667 | 0 |
| 0.779861111111111 | 0 |
| 0.7805555555555556 | 0 |
| 0.78125 | 0 |
| 0.7819444444444444 | 0 |
| 0.782638888888889 | 0 |
| 0.7833333333333333 | 0 |
| 0.7840277777777778 | 0 |
| 0.7847222222222222 | 0 |
| 0.7854166666666668 | 0 |
| 0.7861111111111111 | 0 |
| 0.7868055555555555 | 0 |
| 0.7875 | 0 |
| 0.7881944444444445 | 0 |
| 0.7888888888888889 | 0 |
| 0.7895833333333333 | 0 |
| 0.7902777777777777 | 0 |
| 0.7909722222222223 | 0 |
| 0.7916666666666666 | 0 |
| 0.7923611111111111 | 0 |
| 0.7930555555555556 | 0 |
| 0.7937500000000001 | 0 |
| 0.7944444444444444 | 0 |
| 0.7951388888888888 | 0 |
| 0.7958333333333334 | 0 |
| 0.7965277777777778 | 0 |
| 0.7972222222222222 | 0 |
| 0.7979166666666666 | 0 |
| 0.7986111111111112 | 0 |
| 0.7993055555555556 | 0 |
| 0.7999999999999999 | 0 |
| 0.8006944444444444 | 0 |
| 0.8013888888888889 | 0 |
| 0.8020833333333334 | 0 |
| 0.8027777777777777 | 0 |
| 0.8034722222222223 | 0 |
| 0.8041666666666667 | 0 |
| 0.8048611111111111 | 0 |
| 0.8055555555555555 | 0 |
| 0.80625 | 0 |
| 0.8069444444444445 | 0 |
| 0.8076388888888889 | 0 |
| 0.8083333333333332 | 0 |
| 0.8090277777777778 | 0 |
| 0.8097222222222222 | 0 |
| 0.8104166666666667 | 0 |
| 0.811111111111111 | 0 |
| 0.8118055555555556 | 0 |
| 0.8125 | 0 |
| 0.8131944444444444 | 0 |
| 0.813888888888889 | 0 |
| 0.8145833333333333 | 0 |
| 0.8152777777777778 | 0 |
| 0.8159722222222222 | 0 |
| 0.8166666666666668 | 0 |
| 0.8173611111111111 | 0 |
| 0.8180555555555555 | 0 |
| 0.81875 | 0 |
| 0.8194444444444445 | 0 |
| 0.8201388888888889 | 0 |
| 0.8208333333333333 | 0 |
| 0.8215277777777777 | 0 |
| 0.8222222222222223 | 0 |
| 0.8229166666666666 | 0 |
| 0.8236111111111111 | 0 |
| 0.8243055555555556 | 0 |
| 0.8250000000000001 | 0 |
| 0.8256944444444444 | 0 |
| 0.8263888888888888 | 0 |
| 0.8270833333333334 | 0 |
| 0.8277777777777778 | 0 |
| 0.8284722222222222 | 0 |
| 0.8291666666666666 | 0 |
| 0.8298611111111112 | 0 |
| 0.8305555555555556 | 0 |
| 0.8312499999999999 | 0 |
| 0.8319444444444444 | 0 |
| 0.8326388888888889 | 0 |
| 0.8333333333333334 | 0 |
| 0.8340277777777777 | 0 |
| 0.8347222222222223 | 0 |
| 0.8354166666666667 | 0 |
| 0.8361111111111111 | 0 |
| 0.8368055555555555 | 0 |
| 0.8375 | 0 |
| 0.8381944444444445 | 0 |
| 0.8388888888888889 | 0 |
| 0.8395833333333332 | 0 |
| 0.8402777777777778 | 0 |
| 0.8409722222222222 | 0 |
| 0.8416666666666667 | 0 |
| 0.842361111111111 | 0 |
| 0.8430555555555556 | 0 |
| 0.84375 | 0 |
| 0.8444444444444444 | 0 |
| 0.845138888888889 | 0 |
| 0.8458333333333333 | 0 |
| 0.8465277777777778 | 0 |
| 0.8472222222222222 | 0 |
| 0.8479166666666668 | 0 |
| 0.8486111111111111 | 0 |
| 0.8493055555555555 | 0 |
| 0.85 | 0 |
| 0.8506944444444445 | 0 |
| 0.8513888888888889 | 0 |
| 0.8520833333333333 | 0 |
| 0.8527777777777777 | 0 |
| 0.8534722222222223 | 0 |
| 0.8541666666666666 | 0 |
| 0.8548611111111111 | 0 |
| 0.8555555555555556 | 0 |
| 0.8562500000000001 | 0 |
| 0.8569444444444444 | 0 |
| 0.8576388888888888 | 0 |
| 0.8583333333333334 | 0 |
| 0.8590277777777778 | 0 |
| 0.8597222222222222 | 0 |
| 0.8604166666666666 | 0 |
| 0.8611111111111112 | 0 |
| 0.8618055555555556 | 0 |
| 0.8624999999999999 | 0 |
| 0.8631944444444444 | 0 |
| 0.8638888888888889 | 0 |
| 0.8645833333333334 | 0 |
| 0.8652777777777777 | 0 |
| 0.8659722222222223 | 0 |
| 0.8666666666666667 | 0 |
| 0.8673611111111111 | 0 |
| 0.8680555555555555 | 0 |
| 0.86875 | 0 |
| 0.8694444444444445 | 0 |
| 0.8701388888888889 | 0 |
| 0.8708333333333332 | 0 |
| 0.8715277777777778 | 0 |
| 0.8722222222222222 | 0 |
| 0.8729166666666667 | 0 |
| 0.873611111111111 | 0 |
| 0.8743055555555556 | 0 |
| 0.875 | 0 |
| 0.8756944444444444 | 0 |
| 0.876388888888889 | 0 |
| 0.8770833333333333 | 0 |
| 0.8777777777777778 | 0 |
| 0.8784722222222222 | 0 |
| 0.8791666666666668 | 0 |
| 0.8798611111111111 | 0 |
| 0.8805555555555555 | 0 |
| 0.88125 | 0 |
| 0.8819444444444445 | 0 |
| 0.8826388888888889 | 0 |
| 0.8833333333333333 | 0 |
| 0.8840277777777777 | 0 |
| 0.8847222222222223 | 0 |
| 0.8854166666666666 | 0 |
| 0.8861111111111111 | 0 |
| 0.8868055555555556 | 0 |
| 0.8875000000000001 | 0 |
| 0.8881944444444444 | 0 |
| 0.8888888888888888 | 0 |
| 0.8895833333333334 | 0 |
| 0.8902777777777778 | 0 |
| 0.8909722222222222 | 0 |
| 0.8916666666666666 | 0 |
| 0.8923611111111112 | 0 |
| 0.8930555555555556 | 0 |
| 0.8937499999999999 | 0 |
| 0.8944444444444444 | 0 |
| 0.8951388888888889 | 0 |
| 0.8958333333333334 | 0 |
| 0.8965277777777777 | 0 |
| 0.8972222222222223 | 0 |
| 0.8979166666666667 | 0 |
| 0.8986111111111111 | 0 |
| 0.8993055555555555 | 0 |
| 0.9 | 0 |
| 0.9006944444444445 | 0 |
| 0.9013888888888889 | 0 |
| 0.9020833333333332 | 0 |
| 0.9027777777777778 | 0 |
| 0.9034722222222222 | 0 |
| 0.9041666666666667 | 0 |
| 0.904861111111111 | 0 |
| 0.9055555555555556 | 0 |
| 0.90625 | 0 |
| 0.9069444444444444 | 0 |
| 0.907638888888889 | 0 |
| 0.9083333333333333 | 0 |
| 0.9090277777777778 | 0 |
| 0.9097222222222222 | 0 |
| 0.9104166666666668 | 0 |
| 0.9111111111111111 | 0 |
| 0.9118055555555555 | 0 |
| 0.9125 | 0 |
| 0.9131944444444445 | 0 |
| 0.9138888888888889 | 0 |
| 0.9145833333333333 | 0 |
| 0.9152777777777777 | 0 |
| 0.9159722222222223 | 0 |
| 0.9166666666666666 | 0 |
| 0.9173611111111111 | 0 |
| 0.9180555555555556 | 0 |
| 0.9187500000000001 | 0 |
| 0.9194444444444444 | 0 |
| 0.9201388888888888 | 0 |
| 0.9208333333333334 | 0 |
| 0.9215277777777778 | 0 |
| 0.9222222222222222 | 0 |
| 0.9229166666666666 | 0 |
| 0.9236111111111112 | 0 |
| 0.9243055555555556 | 0 |
| 0.9249999999999999 | 0 |
| 0.9256944444444444 | 0 |
| 0.9263888888888889 | 0 |
| 0.9270833333333334 | 0 |
| 0.9277777777777777 | 0 |
| 0.9284722222222223 | 0 |
| 0.9291666666666667 | 0 |
| 0.9298611111111111 | 0 |
| 0.9305555555555555 | 0 |
| 0.93125 | 0 |
| 0.9319444444444445 | 0 |
| 0.9326388888888889 | 0 |
| 0.9333333333333332 | 0 |
| 0.9340277777777778 | 0 |
| 0.9347222222222222 | 0 |
| 0.9354166666666667 | 0 |
| 0.936111111111111 | 0 |
| 0.9368055555555556 | 0 |
| 0.9375 | 0 |
| 0.9381944444444444 | 0 |
| 0.938888888888889 | 0 |
| 0.9395833333333333 | 0 |
| 0.9402777777777778 | 0 |
| 0.9409722222222222 | 0 |
| 0.9416666666666668 | 0 |
| 0.9423611111111111 | 0 |
| 0.9430555555555555 | 0 |
| 0.94375 | 0 |
| 0.9444444444444445 | 0 |
| 0.9451388888888889 | 0 |
| 0.9458333333333333 | 0 |
| 0.9465277777777777 | 0 |
| 0.9472222222222223 | 0 |
| 0.9479166666666666 | 0 |
| 0.9486111111111111 | 0 |
| 0.9493055555555556 | 0 |
| 0.9500000000000001 | 0 |
| 0.9506944444444444 | 0 |
| 0.9513888888888888 | 0 |
| 0.9520833333333334 | 0 |
| 0.9527777777777778 | 0 |
| 0.9534722222222222 | 0 |
| 0.9541666666666666 | 0 |
| 0.9548611111111112 | 0 |
| 0.9555555555555556 | 0 |
| 0.9562499999999999 | 0 |
| 0.9569444444444444 | 0 |
| 0.9576388888888889 | 0 |
| 0.9583333333333334 | 0 |
| 0.9590277777777777 | 0 |
| 0.9597222222222223 | 0 |
| 0.9604166666666667 | 0 |
| 0.9611111111111111 | 0 |
| 0.9618055555555555 | 0 |
| 0.9625 | 0 |
| 0.9631944444444445 | 0 |
| 0.9638888888888889 | 0 |
| 0.9645833333333332 | 0 |
| 0.9652777777777778 | 0 |
| 0.9659722222222222 | 0 |
| 0.9666666666666667 | 0 |
| 0.967361111111111 | 0 |
| 0.9680555555555556 | 0 |
| 0.96875 | 0 |
| 0.9694444444444444 | 0 |
| 0.970138888888889 | 0 |
| 0.9708333333333333 | 0 |
| 0.9715277777777778 | 0 |
| 0.9722222222222222 | 0 |
| 0.9729166666666668 | 0 |
| 0.9736111111111111 | 0 |
| 0.9743055555555555 | 0 |
| 0.975 | 0 |
| 0.9756944444444445 | 0 |
| 0.9763888888888889 | 0 |
| 0.9770833333333333 | 0 |
| 0.9777777777777777 | 0 |
| 0.9784722222222223 | 0 |
| 0.9791666666666666 | 0 |
| 0.9798611111111111 | 0 |
| 0.9805555555555556 | 0 |
| 0.9812500000000001 | 0 |
| 0.9819444444444444 | 0 |
| 0.9826388888888888 | 0 |
| 0.9833333333333334 | 0 |
| 0.9840277777777778 | 0 |
| 0.9847222222222222 | 0 |
| 0.9854166666666666 | 0 |
| 0.9861111111111112 | 0 |
| 0.9868055555555556 | 0 |
| 0.9874999999999999 | 0 |
| 0.9881944444444444 | 0 |
| 0.9888888888888889 | 0 |
| 0.9895833333333334 | 0 |
| 0.9902777777777777 | 0 |
| 0.9909722222222223 | 0 |
| 0.9916666666666667 | 0 |
| 0.9923611111111111 | 0 |
| 0.9930555555555555 | 0 |
| 0.99375 | 0 |
| 0.9944444444444445 | 0 |
| 0.9951388888888889 | 0 |
| 0.9958333333333332 | 0 |
| 0.9965277777777778 | 0 |
| 0.9972222222222222 | 0 |
| 0.9979166666666667 | 0 |
| 0.998611111111111 | 0 |
| 0.9993055555555556 | 0 |